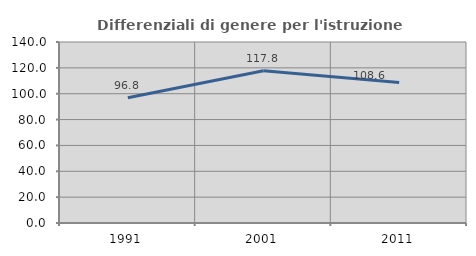
| Category | Differenziali di genere per l'istruzione superiore |
|---|---|
| 1991.0 | 96.838 |
| 2001.0 | 117.811 |
| 2011.0 | 108.617 |